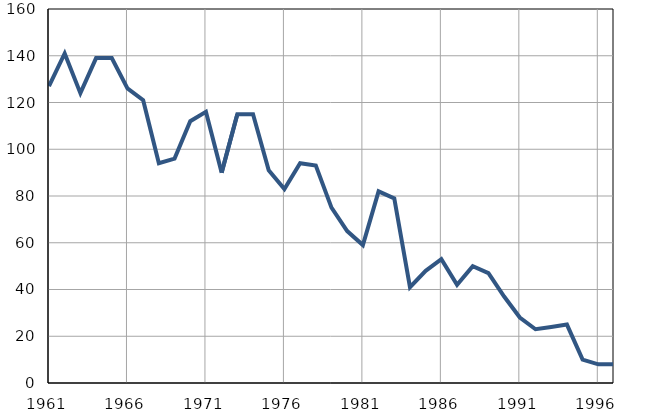
| Category | Умрла 
одојчад |
|---|---|
| 1961.0 | 127 |
| 1962.0 | 141 |
| 1963.0 | 124 |
| 1964.0 | 139 |
| 1965.0 | 139 |
| 1966.0 | 126 |
| 1967.0 | 121 |
| 1968.0 | 94 |
| 1969.0 | 96 |
| 1970.0 | 112 |
| 1971.0 | 116 |
| 1972.0 | 90 |
| 1973.0 | 115 |
| 1974.0 | 115 |
| 1975.0 | 91 |
| 1976.0 | 83 |
| 1977.0 | 94 |
| 1978.0 | 93 |
| 1979.0 | 75 |
| 1980.0 | 65 |
| 1981.0 | 59 |
| 1982.0 | 82 |
| 1983.0 | 79 |
| 1984.0 | 41 |
| 1985.0 | 48 |
| 1986.0 | 53 |
| 1987.0 | 42 |
| 1988.0 | 50 |
| 1989.0 | 47 |
| 1990.0 | 37 |
| 1991.0 | 28 |
| 1992.0 | 23 |
| 1993.0 | 24 |
| 1994.0 | 25 |
| 1995.0 | 10 |
| 1996.0 | 8 |
| 1997.0 | 8 |